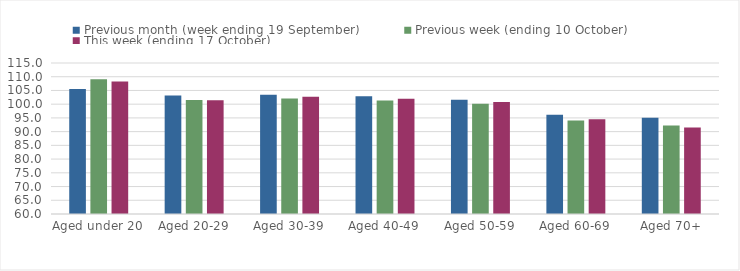
| Category | Previous month (week ending 19 September) | Previous week (ending 10 October) | This week (ending 17 October) |
|---|---|---|---|
| Aged under 20 | 105.53 | 109.05 | 108.27 |
| Aged 20-29 | 103.19 | 101.49 | 101.44 |
| Aged 30-39 | 103.4 | 102.07 | 102.71 |
| Aged 40-49 | 102.93 | 101.3 | 101.94 |
| Aged 50-59 | 101.61 | 100.14 | 100.75 |
| Aged 60-69 | 96.16 | 94.02 | 94.51 |
| Aged 70+ | 95.05 | 92.19 | 91.47 |